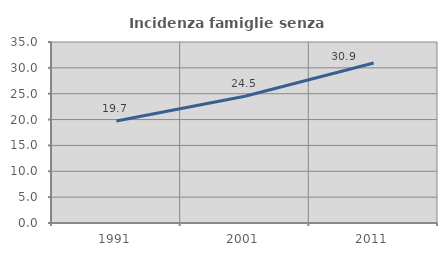
| Category | Incidenza famiglie senza nuclei |
|---|---|
| 1991.0 | 19.705 |
| 2001.0 | 24.523 |
| 2011.0 | 30.934 |